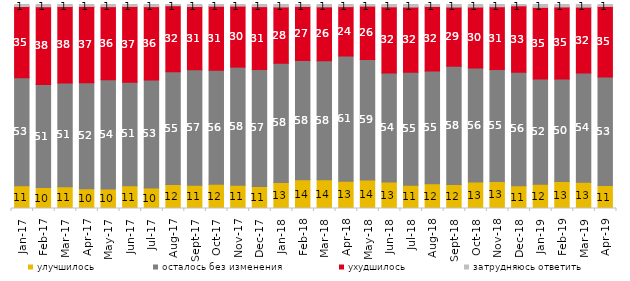
| Category | улучшилось | осталось без изменения | ухудшилось | затрудняюсь ответить |
|---|---|---|---|---|
| 2017-01-01 | 11.15 | 53 | 34.85 | 1 |
| 2017-02-01 | 10.25 | 50.5 | 38.15 | 1.1 |
| 2017-03-01 | 10.7 | 50.75 | 37.5 | 1 |
| 2017-04-01 | 9.7 | 51.95 | 37.4 | 0.95 |
| 2017-05-01 | 9.5 | 53.65 | 35.8 | 1.05 |
| 2017-06-01 | 11.2 | 50.7 | 37.15 | 0.95 |
| 2017-07-01 | 10.05 | 52.95 | 35.95 | 1.05 |
| 2017-08-01 | 11.8 | 55.2 | 32.4 | 0.6 |
| 2017-09-01 | 11.35 | 56.7 | 30.95 | 1 |
| 2017-10-01 | 11.9 | 55.9 | 31.35 | 0.85 |
| 2017-11-01 | 11.45 | 57.85 | 29.9 | 0.8 |
| 2017-12-01 | 10.8 | 57.35 | 30.8 | 1.05 |
| 2018-01-01 | 12.75 | 58.45 | 27.6 | 1.2 |
| 2018-02-01 | 14.1 | 58.4 | 26.55 | 0.95 |
| 2018-03-01 | 14.1 | 58.3 | 26.45 | 1.15 |
| 2018-04-01 | 13.35 | 61.4 | 24.2 | 1.05 |
| 2018-05-01 | 14 | 59.1 | 26.1 | 0.8 |
| 2018-06-01 | 12.95 | 53.5 | 32.4 | 1.15 |
| 2018-07-01 | 11.45 | 55.3 | 32 | 1.25 |
| 2018-08-01 | 12.1 | 55.25 | 31.7 | 0.95 |
| 2018-09-01 | 11.75 | 58 | 29 | 1.25 |
| 2018-10-01 | 12.95 | 55.9 | 29.9 | 1.25 |
| 2018-11-01 | 13.273 | 54.84 | 30.788 | 1.098 |
| 2018-12-01 | 11.2 | 55.6 | 32.55 | 0.65 |
| 2019-01-01 | 11.85 | 51.6 | 35.15 | 1.4 |
| 2019-02-01 | 13.2 | 50.3 | 35.3 | 1.2 |
| 2019-03-01 | 12.929 | 53.506 | 32.273 | 1.293 |
| 2019-04-01 | 11.238 | 53.168 | 34.653 | 0.941 |